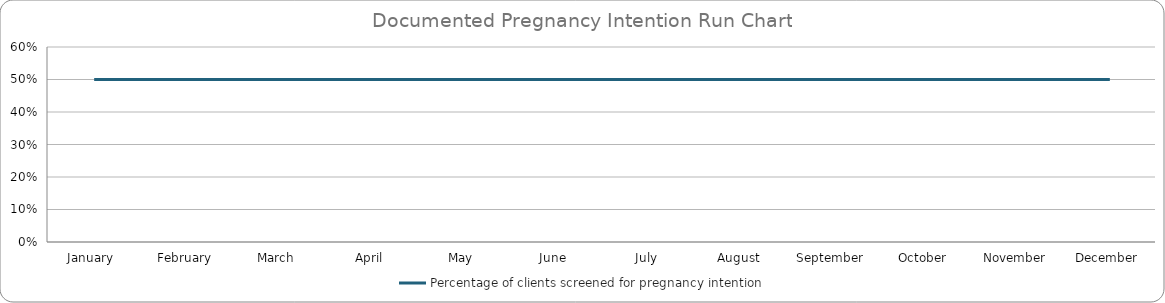
| Category | Percentage of clients screened for pregnancy intention |
|---|---|
| January  | 0.5 |
| February | 0.5 |
| March | 0.5 |
| April | 0.5 |
| May | 0.5 |
| June | 0.5 |
| July | 0.5 |
| August | 0.5 |
| September | 0.5 |
| October | 0.5 |
| November | 0.5 |
| December | 0.5 |